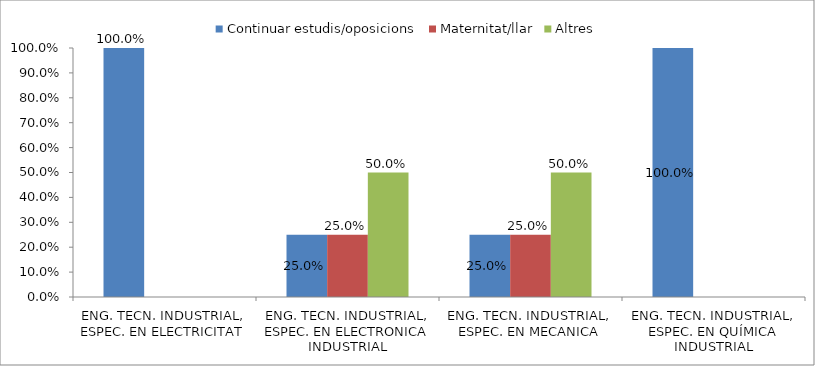
| Category | Continuar estudis/oposicions | Maternitat/llar | Altres |
|---|---|---|---|
| ENG. TECN. INDUSTRIAL, ESPEC. EN ELECTRICITAT | 1 | 0 | 0 |
| ENG. TECN. INDUSTRIAL, ESPEC. EN ELECTRONICA INDUSTRIAL | 0.25 | 0.25 | 0.5 |
| ENG. TECN. INDUSTRIAL, ESPEC. EN MECANICA | 0.25 | 0.25 | 0.5 |
| ENG. TECN. INDUSTRIAL, ESPEC. EN QUÍMICA INDUSTRIAL | 1 | 0 | 0 |